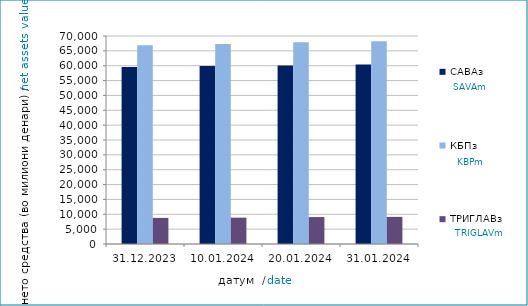
| Category | САВАз | КБПз | ТРИГЛАВз |
|---|---|---|---|
| 2023-12-31 | 59552.475 | 66866.035 | 8788.006 |
| 2024-01-10 | 59881.333 | 67287.612 | 8866.065 |
| 2024-01-20 | 60049.07 | 67931.909 | 9074.372 |
| 2024-01-31 | 60423.116 | 68264.48 | 9125.981 |